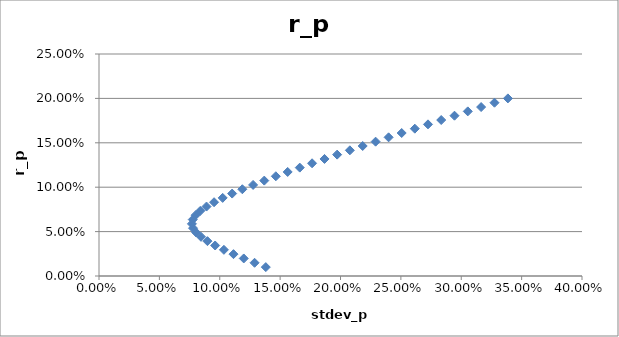
| Category | r_p |
|---|---|
| 0.13814653735844634 | 0.01 |
| 0.1288360998614947 | 0.015 |
| 0.1198867169492569 | 0.02 |
| 0.11138545059467705 | 0.025 |
| 0.10344284285268379 | 0.029 |
| 0.09619737158918958 | 0.034 |
| 0.08981790630965515 | 0.039 |
| 0.08450081488949766 | 0.044 |
| 0.08045699826668964 | 0.049 |
| 0.07788503613108778 | 0.054 |
| 0.07693268854104465 | 0.059 |
| 0.07765956289552309 | 0.064 |
| 0.08001991178482905 | 0.068 |
| 0.08387594580651672 | 0.073 |
| 0.08903354265545893 | 0.078 |
| 0.09528157524192657 | 0.083 |
| 0.10242067600510253 | 0.088 |
| 0.1102779243369191 | 0.093 |
| 0.11871080721119756 | 0.098 |
| 0.12760525197407338 | 0.103 |
| 0.1368713057728215 | 0.107 |
| 0.14643844367687547 | 0.112 |
| 0.15625137010282963 | 0.117 |
| 0.16626657199050943 | 0.122 |
| 0.1764496095033845 | 0.127 |
| 0.18677303300068843 | 0.132 |
| 0.1972147977424956 | 0.137 |
| 0.20775706118182463 | 0.142 |
| 0.2183852694738388 | 0.146 |
| 0.2290874610391667 | 0.151 |
| 0.23985373275715363 | 0.156 |
| 0.2506758282317348 | 0.161 |
| 0.2615468180493698 | 0.166 |
| 0.2724608497266935 | 0.171 |
| 0.2834129507728808 | 0.176 |
| 0.29439887249741403 | 0.181 |
| 0.3054149652843877 | 0.185 |
| 0.31645807833192796 | 0.19 |
| 0.32752547854078057 | 0.195 |
| 0.33861478448992116 | 0.2 |